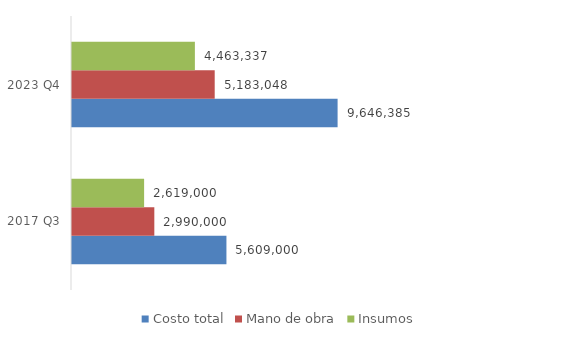
| Category | Costo total | Mano de obra | Insumos |
|---|---|---|---|
| 2017 Q3 | 5609000 | 2990000 | 2619000 |
| 2023 Q4 | 9646384.78 | 5183048 | 4463336.78 |